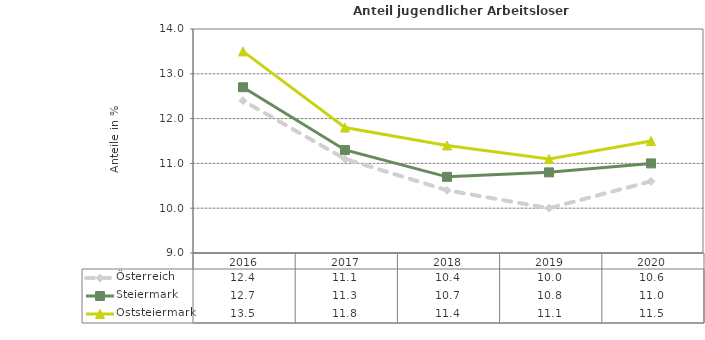
| Category | Österreich | Steiermark | Oststeiermark |
|---|---|---|---|
| 2020.0 | 10.6 | 11 | 11.5 |
| 2019.0 | 10 | 10.8 | 11.1 |
| 2018.0 | 10.4 | 10.7 | 11.4 |
| 2017.0 | 11.1 | 11.3 | 11.8 |
| 2016.0 | 12.4 | 12.7 | 13.5 |